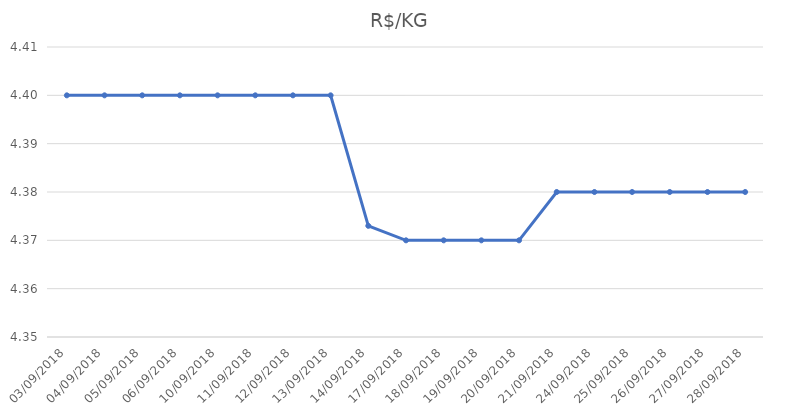
| Category | R$/KG |
|---|---|
| 03/09/2018 | 4.4 |
| 04/09/2018 | 4.4 |
| 05/09/2018 | 4.4 |
| 06/09/2018 | 4.4 |
| 10/09/2018 | 4.4 |
| 11/09/2018 | 4.4 |
| 12/09/2018 | 4.4 |
| 13/09/2018 | 4.4 |
| 14/09/2018 | 4.373 |
| 17/09/2018 | 4.37 |
| 18/09/2018 | 4.37 |
| 19/09/2018 | 4.37 |
| 20/09/2018 | 4.37 |
| 21/09/2018 | 4.38 |
| 24/09/2018 | 4.38 |
| 25/09/2018 | 4.38 |
| 26/09/2018 | 4.38 |
| 27/09/2018 | 4.38 |
| 28/09/2018 | 4.38 |